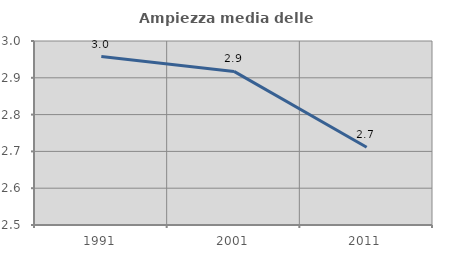
| Category | Ampiezza media delle famiglie |
|---|---|
| 1991.0 | 2.958 |
| 2001.0 | 2.917 |
| 2011.0 | 2.711 |